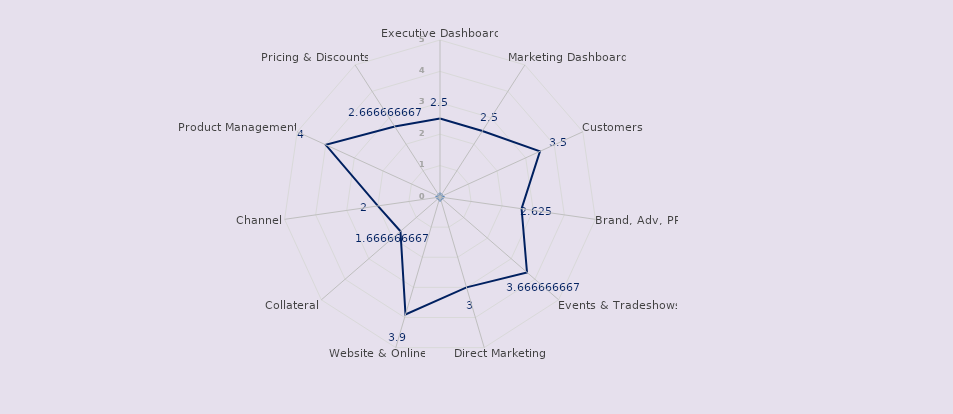
| Category | Maturity Index | Executive Dashboard Marketing Dashboard Customers Brand, Adv, PR Events & Tradeshows Direct Marketing Website & Online Collateral Channel | 3 3 4 3.125 4.166666667 3.5 4.4 2.166666667 2.5 |
|---|---|---|---|
| Executive Dashboard | 2.5 |  |  |
| Marketing Dashboard | 2.5 |  |  |
| Customers | 3.5 |  |  |
| Brand, Adv, PR | 2.625 |  |  |
| Events & Tradeshows | 3.667 |  |  |
| Direct Marketing | 3 |  |  |
| Website & Online | 3.9 |  |  |
| Collateral | 1.667 |  |  |
| Channel | 2 |  |  |
| Product Management | 4 |  |  |
| Pricing & Discounts | 2.667 |  |  |